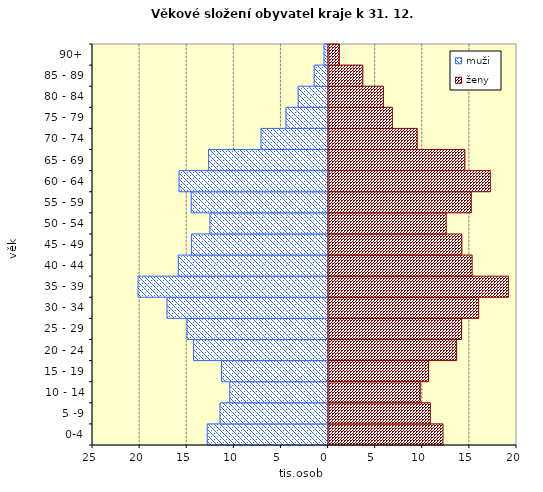
| Category | muži | ženy |
|---|---|---|
| 0-4 | -12821 | 12251 |
|  5 -9 | -11467 | 10909 |
|  10 - 14 | -10430 | 9837 |
| 15 - 19 | -11309 | 10726 |
| 20 - 24 | -14268 | 13701 |
| 25 - 29 | -14978 | 14227 |
| 30 - 34 | -17088 | 16038 |
| 35 - 39 | -20164 | 19192 |
| 40 - 44 | -15898 | 15343 |
| 45 - 49 | -14501 | 14252 |
| 50 - 54 | -12538 | 12592 |
| 55 - 59 | -14518 | 15253 |
| 60 - 64 | -15809 | 17275 |
| 65 - 69 | -12676 | 14572 |
| 70 - 74 | -7116 | 9513 |
| 75 - 79 | -4467 | 6877 |
| 80 - 84 | -3171 | 5927 |
| 85 - 89 | -1472 | 3742 |
| 90+ | -428 | 1248 |